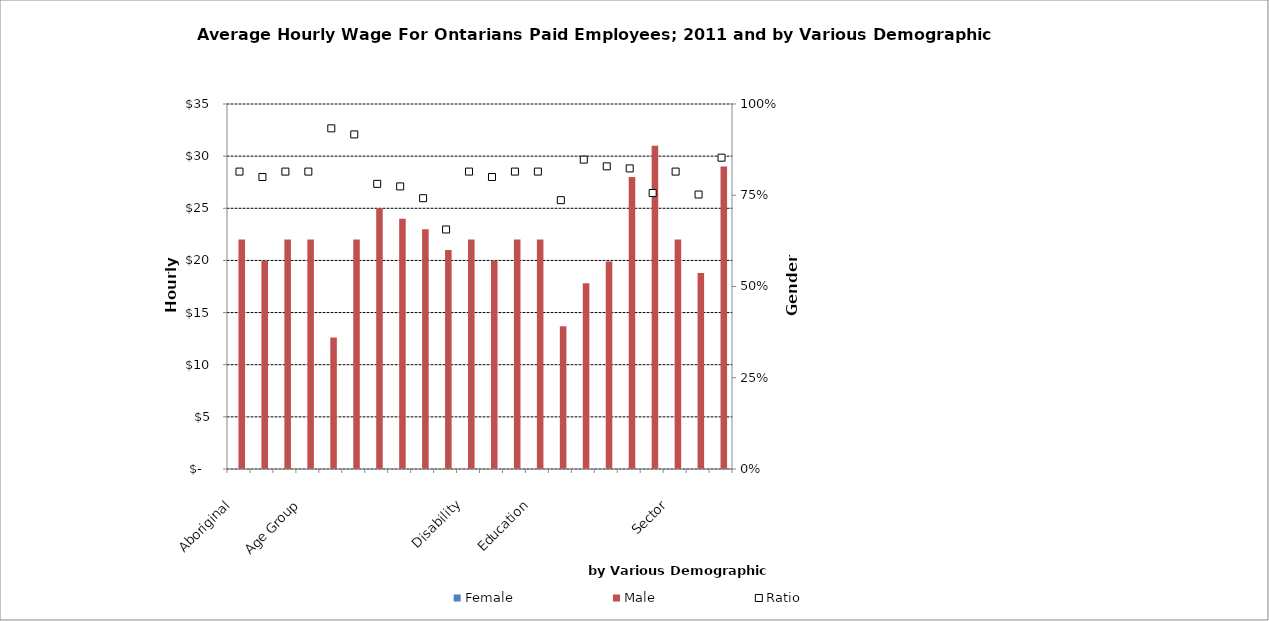
| Category | Female | Male |
|---|---|---|
|  Aboriginal  | 0 | 22 |
|    | 0 | 20 |
|    | 0 | 22 |
|  Age Group  | 0 | 22 |
|    | 0 | 12.6 |
|    | 0 | 22 |
|    | 0 | 25 |
|    | 0 | 24 |
|    | 0 | 23 |
|    | 0 | 21 |
|  Disability  | 0 | 22 |
|    | 0 | 20 |
|    | 0 | 22 |
|  Education  | 0 | 22 |
|    | 0 | 13.7 |
|    | 0 | 17.8 |
|    | 0 | 19.9 |
|    | 0 | 28 |
|    | 0 | 31 |
|  Sector  | 0 | 22 |
|    | 0 | 18.8 |
|    | 0 | 29 |